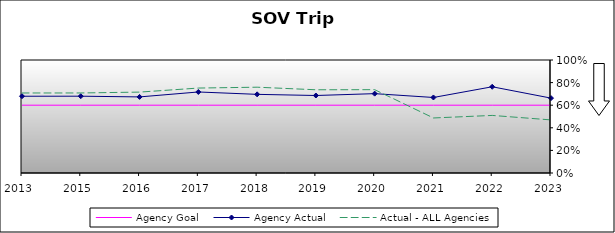
| Category | Agency Goal | Agency Actual | Actual - ALL Agencies |
|---|---|---|---|
| 2013.0 | 0.6 | 0.679 | 0.708 |
| 2015.0 | 0.6 | 0.68 | 0.708 |
| 2016.0 | 0.6 | 0.673 | 0.716 |
| 2017.0 | 0.6 | 0.717 | 0.752 |
| 2018.0 | 0.6 | 0.696 | 0.759 |
| 2019.0 | 0.6 | 0.686 | 0.736 |
| 2020.0 | 0.6 | 0.702 | 0.737 |
| 2021.0 | 0.6 | 0.668 | 0.487 |
| 2022.0 | 0.6 | 0.763 | 0.509 |
| 2023.0 | 0.6 | 0.663 | 0.47 |